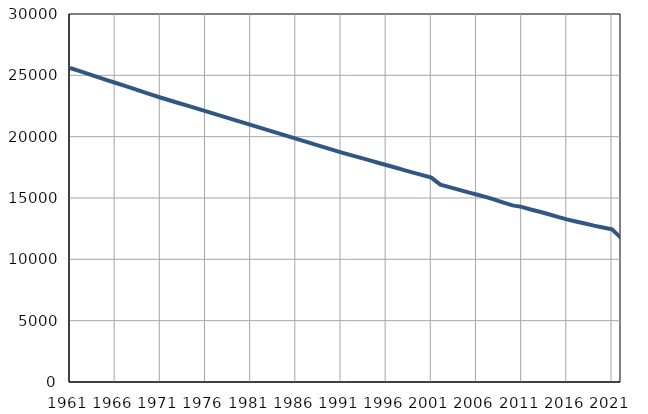
| Category | Population
size |
|---|---|
| 1961.0 | 25599 |
| 1962.0 | 25358 |
| 1963.0 | 25118 |
| 1964.0 | 24877 |
| 1965.0 | 24636 |
| 1966.0 | 24396 |
| 1967.0 | 24155 |
| 1968.0 | 23914 |
| 1969.0 | 23673 |
| 1970.0 | 23433 |
| 1971.0 | 23192 |
| 1972.0 | 22969 |
| 1973.0 | 22747 |
| 1974.0 | 22524 |
| 1975.0 | 22301 |
| 1976.0 | 22079 |
| 1977.0 | 21856 |
| 1978.0 | 21633 |
| 1979.0 | 21410 |
| 1980.0 | 21188 |
| 1981.0 | 20965 |
| 1982.0 | 20741 |
| 1983.0 | 20517 |
| 1984.0 | 20293 |
| 1985.0 | 20069 |
| 1986.0 | 19844 |
| 1987.0 | 19620 |
| 1988.0 | 19396 |
| 1989.0 | 19172 |
| 1990.0 | 18948 |
| 1991.0 | 18724 |
| 1992.0 | 18517 |
| 1993.0 | 18310 |
| 1994.0 | 18104 |
| 1995.0 | 17897 |
| 1996.0 | 17690 |
| 1997.0 | 17483 |
| 1998.0 | 17276 |
| 1999.0 | 17069 |
| 2000.0 | 16863 |
| 2001.0 | 16656 |
| 2002.0 | 16089 |
| 2003.0 | 15882 |
| 2004.0 | 15688 |
| 2005.0 | 15476 |
| 2006.0 | 15282 |
| 2007.0 | 15087 |
| 2008.0 | 14872 |
| 2009.0 | 14629 |
| 2010.0 | 14395 |
| 2011.0 | 14275 |
| 2012.0 | 14063 |
| 2013.0 | 13877 |
| 2014.0 | 13675 |
| 2015.0 | 13456 |
| 2016.0 | 13258 |
| 2017.0 | 13080 |
| 2018.0 | 12919 |
| 2019.0 | 12747 |
| 2020.0 | 12595 |
| 2021.0 | 12442 |
| 2022.0 | 11754 |